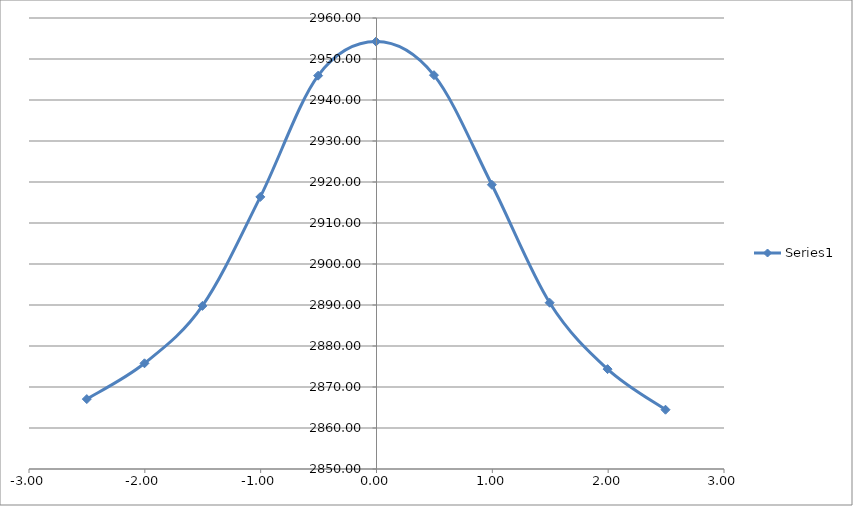
| Category | Series 0 |
|---|---|
| -2.5010000000000003 | 2867.054 |
| -2.003 | 2875.784 |
| -1.5030000000000001 | 2889.782 |
| -1.0030000000000001 | 2916.361 |
| -0.5040000000000004 | 2945.936 |
| -0.004000000000000448 | 2954.246 |
| 0.49599999999999955 | 2946.059 |
| 0.9959999999999996 | 2919.33 |
| 1.495 | 2890.554 |
| 1.995 | 2874.36 |
| 2.495 | 2864.456 |